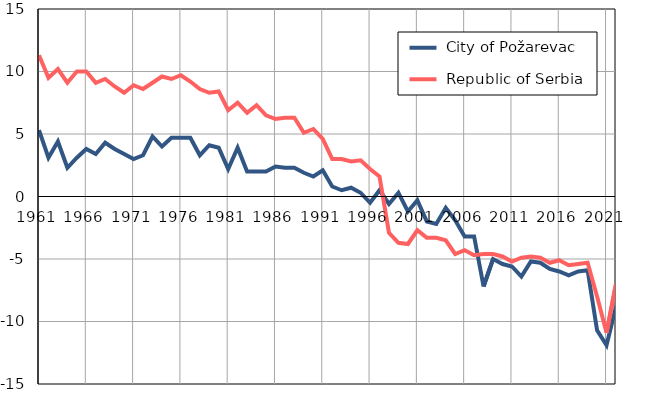
| Category |  City of Požarevac |  Republic of Serbia |
|---|---|---|
| 1961.0 | 5.3 | 11.3 |
| 1962.0 | 3.1 | 9.5 |
| 1963.0 | 4.4 | 10.2 |
| 1964.0 | 2.3 | 9.1 |
| 1965.0 | 3.1 | 10 |
| 1966.0 | 3.8 | 10 |
| 1967.0 | 3.4 | 9.1 |
| 1968.0 | 4.3 | 9.4 |
| 1969.0 | 3.8 | 8.8 |
| 1970.0 | 3.4 | 8.3 |
| 1971.0 | 3 | 8.9 |
| 1972.0 | 3.3 | 8.6 |
| 1973.0 | 4.8 | 9.1 |
| 1974.0 | 4 | 9.6 |
| 1975.0 | 4.7 | 9.4 |
| 1976.0 | 4.7 | 9.7 |
| 1977.0 | 4.7 | 9.2 |
| 1978.0 | 3.3 | 8.6 |
| 1979.0 | 4.1 | 8.3 |
| 1980.0 | 3.9 | 8.4 |
| 1981.0 | 2.2 | 6.9 |
| 1982.0 | 3.9 | 7.5 |
| 1983.0 | 2 | 6.7 |
| 1984.0 | 2 | 7.3 |
| 1985.0 | 2 | 6.5 |
| 1986.0 | 2.4 | 6.2 |
| 1987.0 | 2.3 | 6.3 |
| 1988.0 | 2.3 | 6.3 |
| 1989.0 | 1.9 | 5.1 |
| 1990.0 | 1.6 | 5.4 |
| 1991.0 | 2.1 | 4.6 |
| 1992.0 | 0.8 | 3 |
| 1993.0 | 0.5 | 3 |
| 1994.0 | 0.7 | 2.8 |
| 1995.0 | 0.3 | 2.9 |
| 1996.0 | -0.5 | 2.2 |
| 1997.0 | 0.5 | 1.6 |
| 1998.0 | -0.6 | -2.9 |
| 1999.0 | 0.3 | -3.7 |
| 2000.0 | -1.2 | -3.8 |
| 2001.0 | -0.3 | -2.7 |
| 2002.0 | -2 | -3.3 |
| 2003.0 | -2.2 | -3.3 |
| 2004.0 | -0.9 | -3.5 |
| 2005.0 | -1.9 | -4.6 |
| 2006.0 | -3.2 | -4.3 |
| 2007.0 | -3.2 | -4.7 |
| 2008.0 | -7.2 | -4.6 |
| 2009.0 | -5 | -4.6 |
| 2010.0 | -5.4 | -4.8 |
| 2011.0 | -5.6 | -5.2 |
| 2012.0 | -6.4 | -4.9 |
| 2013.0 | -5.2 | -4.8 |
| 2014.0 | -5.3 | -4.9 |
| 2015.0 | -5.8 | -5.3 |
| 2016.0 | -6 | -5.1 |
| 2017.0 | -6.3 | -5.5 |
| 2018.0 | -6 | -5.4 |
| 2019.0 | -5.9 | -5.3 |
| 2020.0 | -10.7 | -8 |
| 2021.0 | -11.9 | -10.9 |
| 2022.0 | -8.8 | -7 |